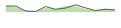
| Category | Series 1 |
|---|---|
| 0 | 20 |
| 1 | 20 |
| 2 | 3 |
| 3 | 2 |
| 4 | 18 |
| 5 | 9 |
| 6 | 13 |
| 7 | 24 |
| 8 | 14 |
| 9 | 5 |
| 10 | 9 |
| 11 | 7 |